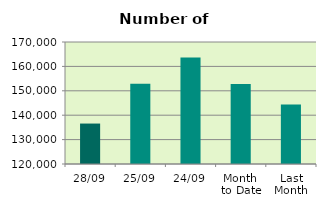
| Category | Series 0 |
|---|---|
| 28/09 | 136578 |
| 25/09 | 152902 |
| 24/09 | 163694 |
| Month 
to Date | 152802.1 |
| Last
Month | 144368.095 |